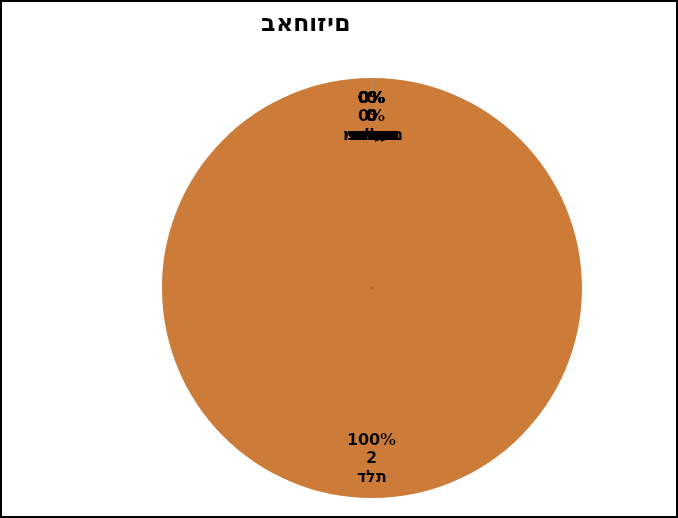
| Category | Series 0 |
|---|---|
| פחמים, מנוע | 0 |
| ניקוי פילטר | 0 |
| סתימה פנימית | 0 |
| חיישן חום | 0 |
|  גוף חימום | 0 |
| דלת | 2 |
| כרטיס | 0 |
| רצועה | 0 |
| משאבה | 0 |
| קפיצים ובולמים | 0 |
|  | 0 |
| נזילה | 0 |
| שונות | 0 |